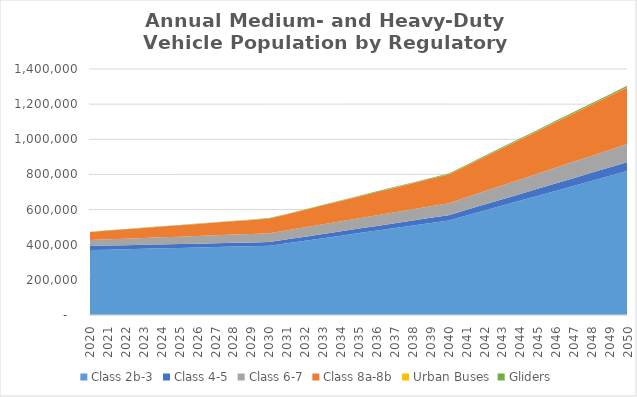
| Category | Class 2b-3 | Class 4-5 | Class 6-7 | Class 8a-8b | Urban Buses | Gliders |
|---|---|---|---|---|---|---|
| 2020.0 | 369380 | 23240 | 33950 | 46190 | 610 | 740 |
| 2021.0 | 371880 | 22990 | 35570 | 49920 | 620 | 860 |
| 2022.0 | 374380 | 22740 | 37190 | 53650 | 630 | 990 |
| 2023.0 | 376870 | 22500 | 38820 | 57370 | 640 | 1110 |
| 2024.0 | 379370 | 22250 | 40440 | 61100 | 650 | 1240 |
| 2025.0 | 381870 | 22000 | 42060 | 64830 | 660 | 1360 |
| 2026.0 | 384370 | 21750 | 43680 | 68560 | 670 | 1480 |
| 2027.0 | 386860 | 21510 | 45300 | 72280 | 680 | 1600 |
| 2028.0 | 389360 | 21260 | 46930 | 76010 | 690 | 1730 |
| 2029.0 | 391850 | 21020 | 48550 | 79730 | 700 | 1850 |
| 2030.0 | 394350 | 20770 | 50170 | 83460 | 710 | 1970 |
| 2031.0 | 408690 | 21740 | 51970 | 91480 | 720 | 2230 |
| 2032.0 | 423030 | 22710 | 53770 | 99500 | 730 | 2490 |
| 2033.0 | 437360 | 23680 | 55560 | 107520 | 730 | 2750 |
| 2034.0 | 451700 | 24650 | 57360 | 115540 | 740 | 3010 |
| 2035.0 | 466040 | 25620 | 59160 | 123560 | 750 | 3270 |
| 2036.0 | 480380 | 26590 | 60960 | 131580 | 760 | 3530 |
| 2037.0 | 494710 | 27560 | 62750 | 139600 | 770 | 3790 |
| 2038.0 | 509050 | 28530 | 64550 | 147620 | 780 | 4060 |
| 2039.0 | 523380 | 29500 | 66340 | 155640 | 790 | 4320 |
| 2040.0 | 537720 | 30470 | 68140 | 163660 | 800 | 4580 |
| 2041.0 | 566030 | 32420 | 71700 | 179600 | 810 | 4960 |
| 2042.0 | 594340 | 34380 | 75270 | 195540 | 810 | 5340 |
| 2043.0 | 622650 | 36330 | 78830 | 211480 | 820 | 5730 |
| 2044.0 | 650960 | 38290 | 82400 | 227420 | 820 | 6110 |
| 2045.0 | 679270 | 40240 | 85960 | 243360 | 830 | 6490 |
| 2046.0 | 707580 | 42190 | 89520 | 259300 | 830 | 6870 |
| 2047.0 | 735890 | 44150 | 93080 | 275240 | 840 | 7250 |
| 2048.0 | 764200 | 46100 | 96650 | 291190 | 840 | 7630 |
| 2049.0 | 792510 | 48060 | 100210 | 307130 | 850 | 8010 |
| 2050.0 | 820820 | 50010 | 103770 | 323070 | 850 | 8390 |